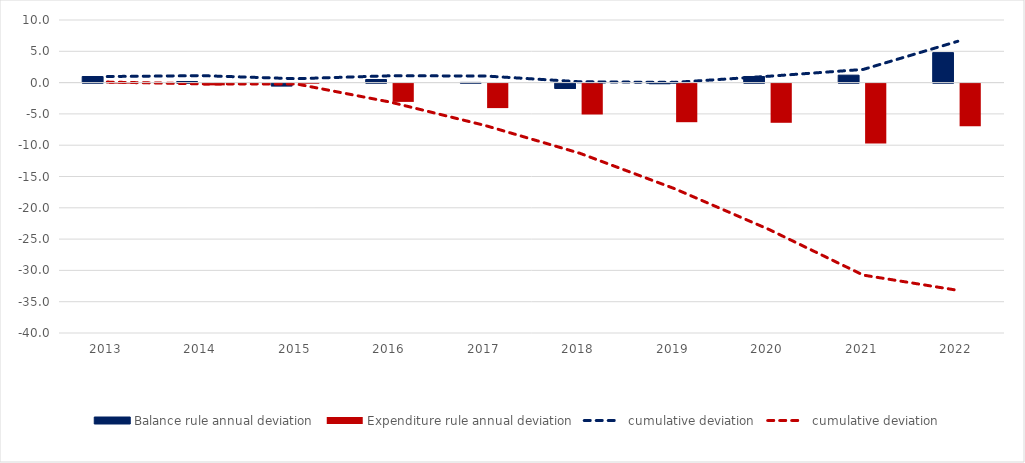
| Category | Balance rule | Expenditure rule |
|---|---|---|
| 2013.0 | 0.972 | 0.081 |
| 2014.0 | 0.176 | -0.282 |
| 2015.0 | -0.447 | -0.018 |
| 2016.0 | 0.49 | -2.923 |
| 2017.0 | 0.029 | -3.914 |
| 2018.0 | -0.848 | -4.935 |
| 2019.0 | -0.089 | -6.166 |
| 2020.0 | 0.977 | -6.261 |
| 2021.0 | 1.191 | -9.583 |
| 2022.0 | 4.791 | -6.799 |